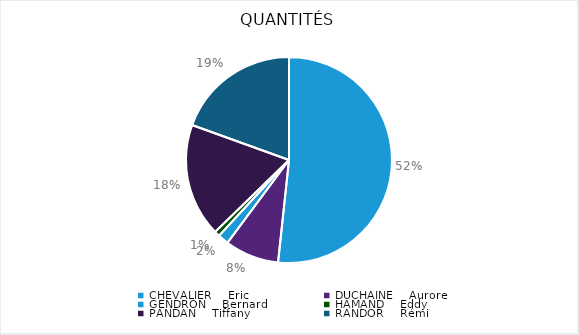
| Category | Quantité |
|---|---|
| CHEVALIER    Eric | 61 |
| DUCHAINE    Aurore | -10 |
| GENDRON    Bernard | -2 |
| HAMAND    Eddy | -1 |
| PANDAN    Tiffany | -21 |
| RANDOR    Rémi | -23 |